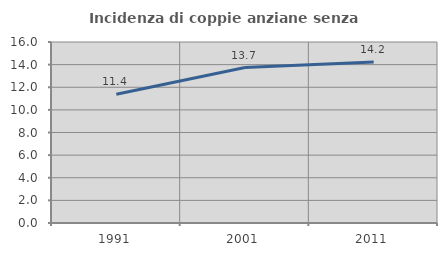
| Category | Incidenza di coppie anziane senza figli  |
|---|---|
| 1991.0 | 11.383 |
| 2001.0 | 13.745 |
| 2011.0 | 14.227 |